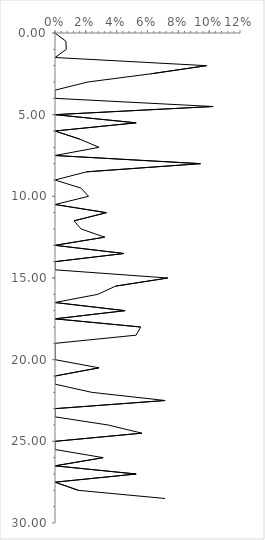
| Category | Series 0 |
|---|---|
| 0.0 | 0 |
| 0.007042253521126761 | 0.5 |
| 0.007352941176470588 | 1 |
| 0.0 | 1.5 |
| 0.09826589595375723 | 2 |
| 0.062111801242236024 | 2.5 |
| 0.02127659574468085 | 3 |
| 0.0 | 3.5 |
| 0.0 | 4 |
| 0.10256410256410256 | 4.5 |
| 0.0 | 5 |
| 0.05263157894736842 | 5.5 |
| 0.0 | 6 |
| 0.016129032258064516 | 6.5 |
| 0.02857142857142857 | 7 |
| 0.0 | 7.5 |
| 0.09433962264150944 | 8 |
| 0.02040816326530612 | 8.5 |
| 0.0 | 9 |
| 0.01694915254237288 | 9.5 |
| 0.021739130434782608 | 10 |
| 0.0 | 10.5 |
| 0.03333333333333333 | 11 |
| 0.012345679012345678 | 11.5 |
| 0.01694915254237288 | 12 |
| 0.03225806451612903 | 12.5 |
| 0.0 | 13 |
| 0.04477611940298507 | 13.5 |
| 0.0 | 14 |
| 0.0 | 14.5 |
| 0.07317073170731707 | 15 |
| 0.0392156862745098 | 15.5 |
| 0.027777777777777776 | 16 |
| 0.0 | 16.5 |
| 0.045454545454545456 | 17 |
| 0.0 | 17.5 |
| 0.05555555555555555 | 18 |
| 0.05263157894736842 | 18.5 |
| 0.0 | 19 |
| 0.0 | 19.5 |
| 0.0 | 20 |
| 0.02857142857142857 | 20.5 |
| 0.0 | 21 |
| 0.0 | 21.5 |
| 0.023809523809523808 | 22 |
| 0.07142857142857142 | 22.5 |
| 0.0 | 23 |
| 0.0 | 23.5 |
| 0.034482758620689655 | 24 |
| 0.056338028169014086 | 24.5 |
| 0.0 | 25 |
| 0.0 | 25.5 |
| 0.03125 | 26 |
| 0.0 | 26.5 |
| 0.05263157894736842 | 27 |
| 0.0 | 27.5 |
| 0.015151515151515152 | 28 |
| 0.07142857142857142 | 28.5 |